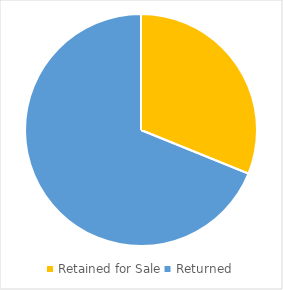
| Category | Series 0 |
|---|---|
| Retained for Sale | 902 |
| Returned | 1995 |